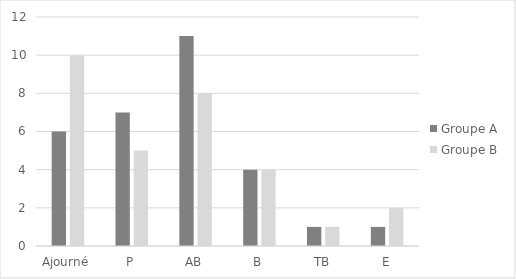
| Category | Groupe A | Groupe B |
|---|---|---|
| Ajourné | 6 | 10 |
| P | 7 | 5 |
| AB | 11 | 8 |
| B | 4 | 4 |
| TB | 1 | 1 |
| E | 1 | 2 |